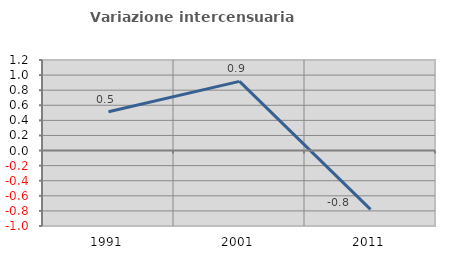
| Category | Variazione intercensuaria annua |
|---|---|
| 1991.0 | 0.514 |
| 2001.0 | 0.917 |
| 2011.0 | -0.78 |